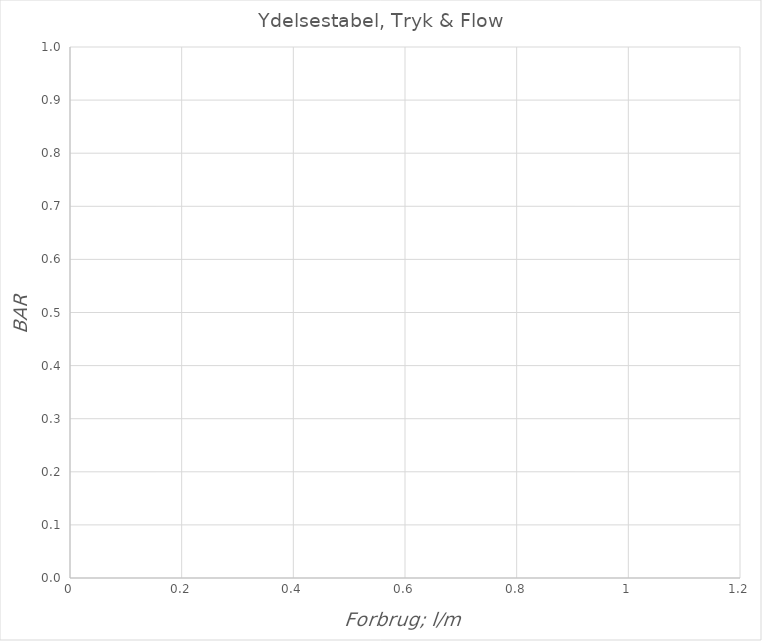
| Category | Series 0 |
|---|---|
|  | 0 |
|  | 0.5 |
|  | 1 |
|  | 1.5 |
|  | 2 |
|  | 2.5 |
|  | 3 |
|  | 3.5 |
|  | 4 |
|  | 4.5 |
|  | 5 |